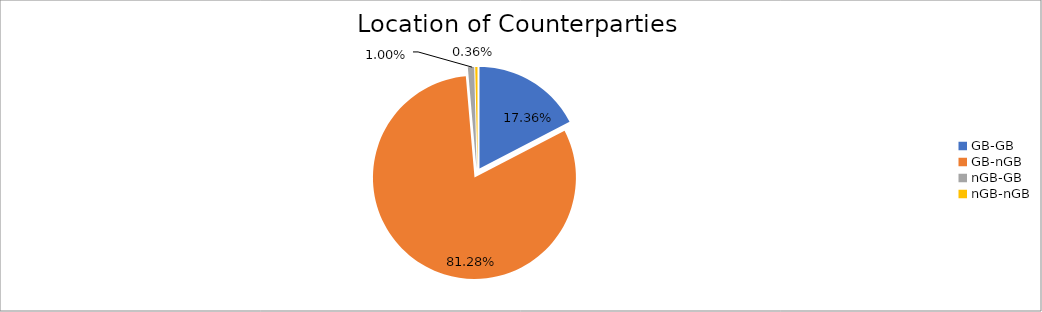
| Category | Series 0 |
|---|---|
| GB-GB | 1720073.975 |
| GB-nGB | 8051727.507 |
| nGB-GB | 99345.542 |
| nGB-nGB | 35622.986 |